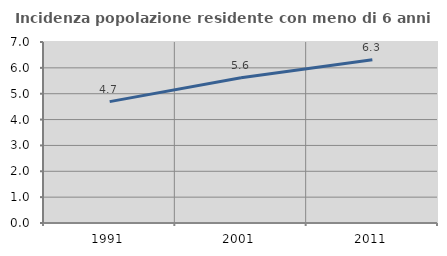
| Category | Incidenza popolazione residente con meno di 6 anni |
|---|---|
| 1991.0 | 4.694 |
| 2001.0 | 5.616 |
| 2011.0 | 6.313 |